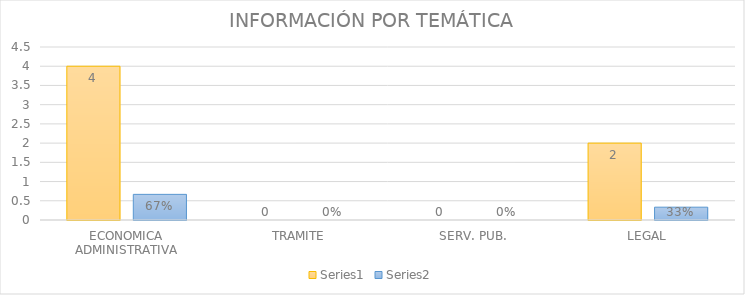
| Category | Series 3 | Series 4 |
|---|---|---|
| ECONOMICA ADMINISTRATIVA | 4 | 0.667 |
| TRAMITE | 0 | 0 |
| SERV. PUB. | 0 | 0 |
| LEGAL | 2 | 0.333 |